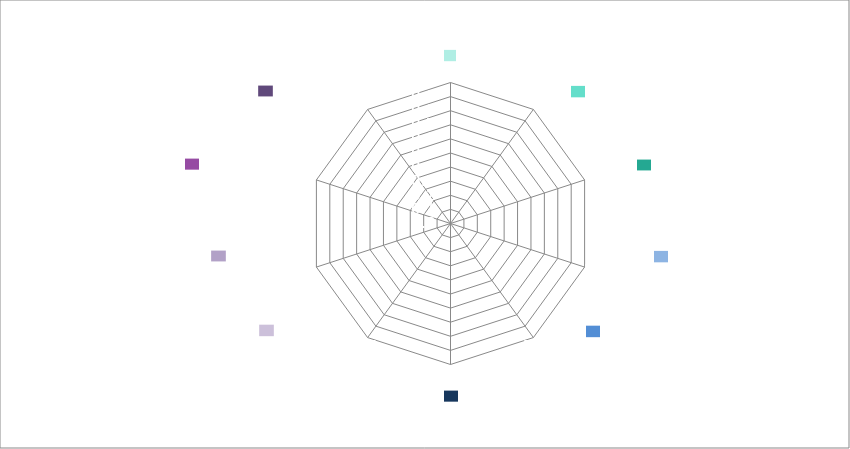
| Category | Series 0 |
|---|---|
| Use | 0 |
| Access | 0 |
| Space | 0 |
| Performance | 0 |
| Engineering | 0 |
| Construction | 0 |
| Character and Innovation | 0 |
| Form and Materials | 0 |
| Staff and Patient Environment | 0 |
| Urban and Social Integration | 0 |